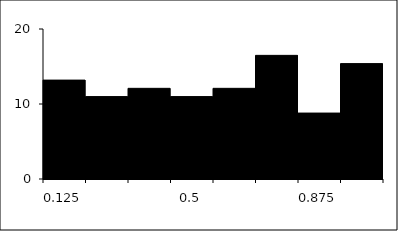
| Category | Series 1 |
|---|---|
| 0.125 | 13.187 |
| 0.25 | 10.989 |
| 0.375 | 12.088 |
| 0.5 | 10.989 |
| 0.625 | 12.088 |
| 0.75 | 16.484 |
| 0.875 | 8.791 |
| 1.0 | 15.385 |